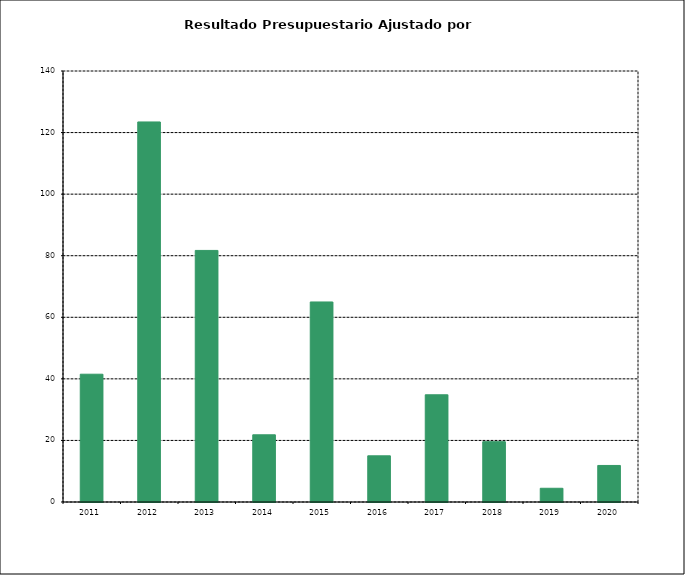
| Category | 2011 2012 2013 2014 2015 2016 2017 2018 2019 2020 |
|---|---|
| 2011.0 | 41.508 |
| 2012.0 | 123.452 |
| 2013.0 | 81.714 |
| 2014.0 | 21.828 |
| 2015.0 | 64.976 |
| 2016.0 | 15.001 |
| 2017.0 | 34.826 |
| 2018.0 | 19.594 |
| 2019.0 | 4.461 |
| 2020.0 | 11.871 |